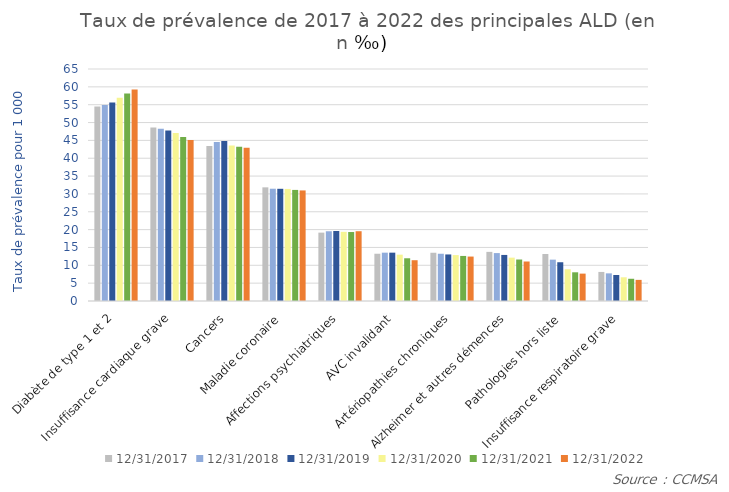
| Category | 31/12/2017 | 31/12/2018 | 31/12/2019 | 31/12/2020 | 31/12/2021 | 31/12/2022 |
|---|---|---|---|---|---|---|
| Diabète de type 1 et 2 | 54.528 | 54.898 | 55.647 | 56.926 | 58.132 | 59.253 |
| Insuffisance cardiaque grave | 48.614 | 48.268 | 47.784 | 47.053 | 45.942 | 45.092 |
| Cancers | 43.449 | 44.536 | 44.808 | 43.6 | 43.201 | 42.905 |
| Maladie coronaire | 31.844 | 31.456 | 31.435 | 31.395 | 31.121 | 30.979 |
| Affections psychiatriques | 19.158 | 19.541 | 19.613 | 19.382 | 19.324 | 19.55 |
| AVC invalidant | 13.242 | 13.54 | 13.544 | 12.982 | 11.972 | 11.426 |
| Artériopathies chroniques | 13.518 | 13.239 | 13.042 | 12.865 | 12.625 | 12.451 |
| Alzheimer et autres démences | 13.762 | 13.424 | 12.906 | 12.147 | 11.622 | 11.067 |
| Pathologies hors liste | 13.161 | 11.584 | 10.86 | 8.896 | 8.042 | 7.671 |
| Insuffisance respiratoire grave | 8.143 | 7.745 | 7.284 | 6.645 | 6.229 | 5.917 |